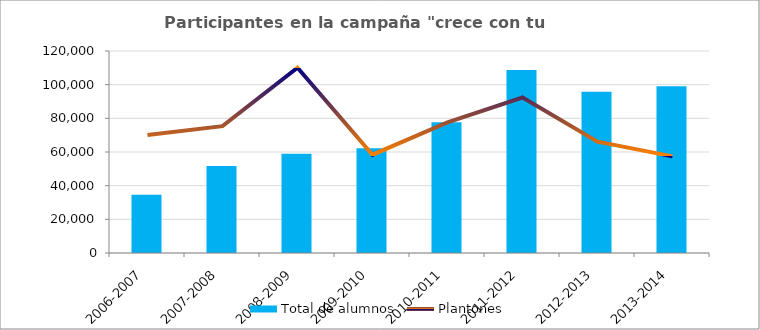
| Category | Total de alumnos |
|---|---|
| 2006-2007 | 34653 |
| 2007-2008 | 51612 |
| 2008-2009 | 58934 |
| 2009-2010 | 62178 |
| 2010-2011 | 77661 |
| 2011-2012 | 108742 |
| 2012-2013 | 95747 |
| 2013-2014 | 99078 |